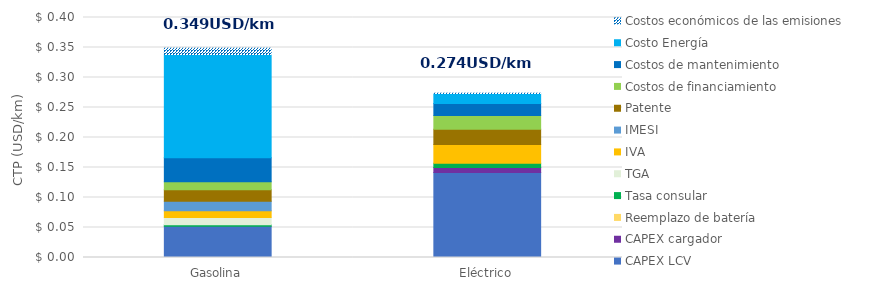
| Category | CAPEX LCV | CAPEX cargador | Reemplazo de batería | Tasa consular | TGA | IVA | IMESI | Patente | Costos de financiamiento | Costos de mantenimiento | Costo Energía | Costos económicos de las emisiones |
|---|---|---|---|---|---|---|---|---|---|---|---|---|
| Gasolina | 0.052 | 0 | 0 | 0.003 | 0.012 | 0.011 | 0.016 | 0.019 | 0.013 | 0.04 | 0.172 | 0.01 |
| Eléctrico | 0.142 | 0.008 | 0 | 0.007 | 0 | 0.031 | 0 | 0.026 | 0.023 | 0.02 | 0.017 | 0 |